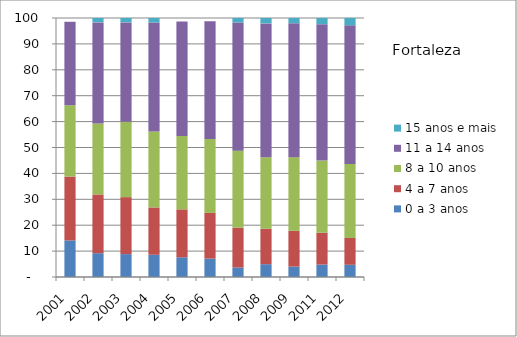
| Category | 0 a 3 anos | 4 a 7 anos | 8 a 10 anos | 11 a 14 anos | 15 anos e mais |
|---|---|---|---|---|---|
| 2001.0 | 14.13 | 24.66 | 27.52 | 32.23 | 0 |
| 2002.0 | 9.19 | 22.68 | 27.42 | 39.02 | 1.69 |
| 2003.0 | 8.84 | 22 | 29.11 | 38.36 | 1.69 |
| 2004.0 | 8.57 | 18.29 | 29.32 | 42.09 | 1.73 |
| 2005.0 | 7.61 | 18.51 | 28.32 | 44.23 | 0 |
| 2006.0 | 7.1 | 17.64 | 28.59 | 45.37 | 0 |
| 2007.0 | 3.66 | 15.4 | 29.73 | 49.47 | 1.74 |
| 2008.0 | 4.95 | 13.7 | 27.59 | 51.68 | 2.09 |
| 2009.0 | 4 | 13.82 | 28.44 | 51.72 | 2.02 |
| 2011.0 | 4.8 | 12.28 | 27.88 | 52.64 | 2.4 |
| 2012.0 | 4.71 | 10.36 | 28.58 | 53.53 | 2.82 |